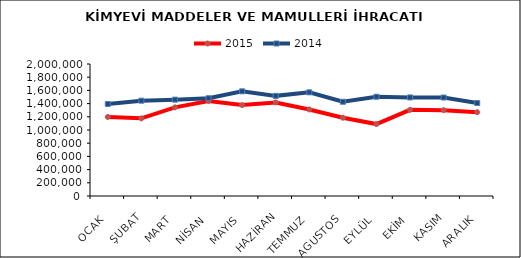
| Category | 2015 | 2014 |
|---|---|---|
| OCAK | 1197787.08 | 1394154.783 |
| ŞUBAT | 1176438.235 | 1444238.532 |
| MART | 1342971.74 | 1460107.772 |
| NİSAN | 1439486.191 | 1481135.892 |
| MAYIS | 1377785.851 | 1585933.104 |
| HAZİRAN | 1417155.515 | 1517248.971 |
| TEMMUZ | 1310800.036 | 1570465.37 |
| AGUSTOS | 1186413.757 | 1427801.17 |
| EYLÜL | 1089878.13 | 1504028.59 |
| EKİM | 1305476.064 | 1493411.16 |
| KASIM | 1301023.864 | 1492112.293 |
| ARALIK | 1269761.749 | 1408435.692 |